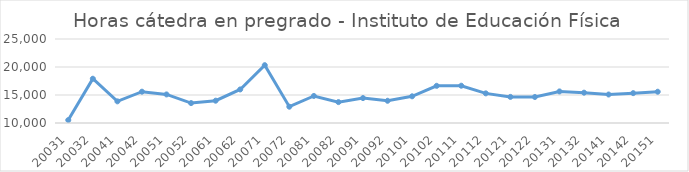
| Category | Total horas |
|---|---|
| 20031 | 10521 |
| 20032 | 17906 |
| 20041 | 13866 |
| 20042 | 15591 |
| 20051 | 15102 |
| 20052 | 13556 |
| 20061 | 13985 |
| 20062 | 15992 |
| 20071 | 20322 |
| 20072 | 12909 |
| 20081 | 14828 |
| 20082 | 13731 |
| 20091 | 14449 |
| 20092 | 13970 |
| 20101 | 14768 |
| 20102 | 16639 |
| 20111 | 16658 |
| 20112 | 15292 |
| 20121 | 14662 |
| 20122 | 14645 |
| 20131 | 15638 |
| 20132 | 15415 |
| 20141 | 15087 |
| 20142 | 15331 |
| 20151 | 15584 |